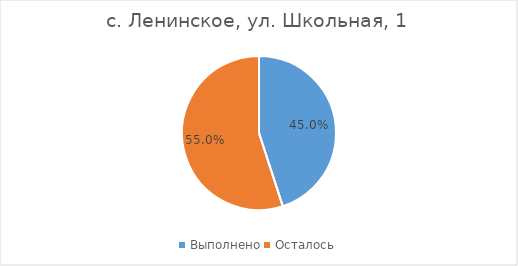
| Category | с. Ленинское, ул. Школьная, 1 |
|---|---|
| Выполнено | 0.45 |
| Осталось | 0.55 |